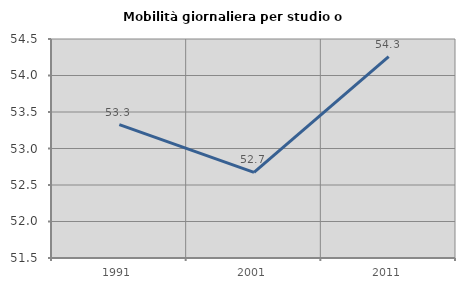
| Category | Mobilità giornaliera per studio o lavoro |
|---|---|
| 1991.0 | 53.327 |
| 2001.0 | 52.673 |
| 2011.0 | 54.258 |